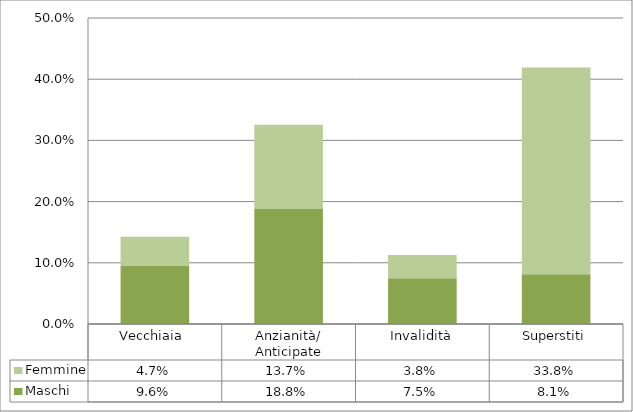
| Category | Maschi | Femmine |
|---|---|---|
| Vecchiaia  | 0.096 | 0.047 |
| Anzianità/ Anticipate | 0.188 | 0.137 |
| Invalidità | 0.075 | 0.038 |
| Superstiti | 0.081 | 0.338 |